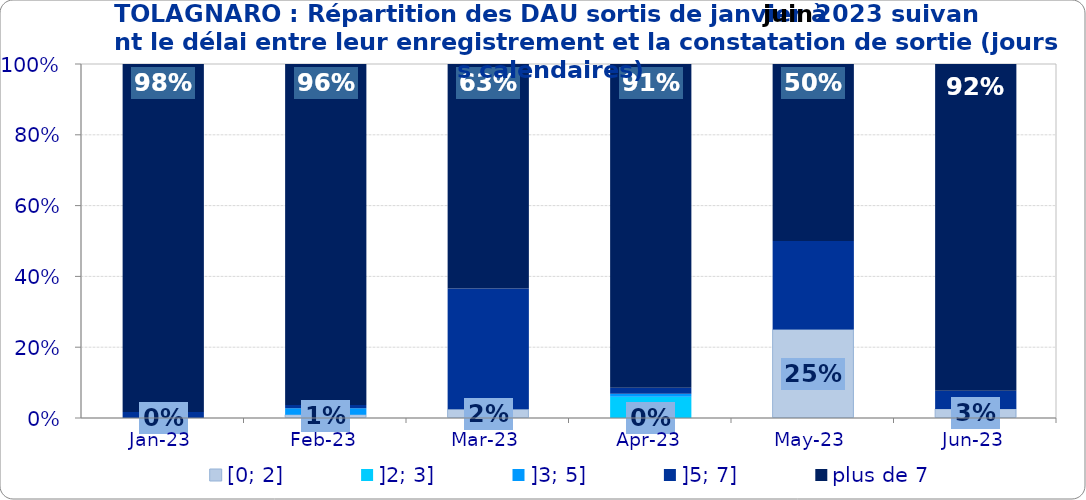
| Category | [0; 2] | ]2; 3] | ]3; 5] | ]5; 7] | plus de 7 |
|---|---|---|---|---|---|
| 2023-01-01 | 0 | 0 | 0 | 0.017 | 0.983 |
| 2023-02-01 | 0.009 | 0 | 0.019 | 0.009 | 0.963 |
| 2023-03-01 | 0.024 | 0 | 0 | 0.341 | 0.634 |
| 2023-04-01 | 0 | 0.06 | 0.009 | 0.017 | 0.915 |
| 2023-05-01 | 0.25 | 0 | 0 | 0.25 | 0.5 |
| 2023-06-01 | 0.026 | 0 | 0 | 0.051 | 0.923 |